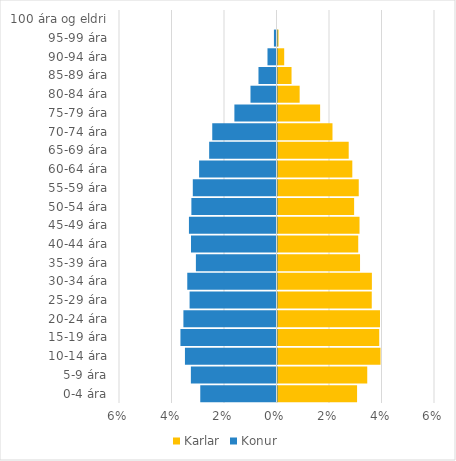
| Category | Karlar | Konur |
|---|---|---|
| 0-4 ára | 0.03 | -0.029 |
| 5-9 ára | 0.034 | -0.033 |
| 10-14 ára | 0.039 | -0.035 |
| 15-19 ára | 0.039 | -0.037 |
| 20-24 ára | 0.039 | -0.035 |
| 25-29 ára | 0.036 | -0.033 |
| 30-34 ára | 0.036 | -0.034 |
| 35-39 ára | 0.031 | -0.031 |
| 40-44 ára | 0.031 | -0.033 |
| 45-49 ára | 0.031 | -0.033 |
| 50-54 ára | 0.029 | -0.032 |
| 55-59 ára | 0.031 | -0.032 |
| 60-64 ára | 0.028 | -0.029 |
| 65-69 ára | 0.027 | -0.026 |
| 70-74 ára | 0.021 | -0.024 |
| 75-79 ára | 0.016 | -0.016 |
| 80-84 ára | 0.008 | -0.01 |
| 85-89 ára | 0.005 | -0.007 |
| 90-94 ára | 0.003 | -0.003 |
| 95-99 ára | 0 | -0.001 |
| 100 ára og eldri | 0 | 0 |